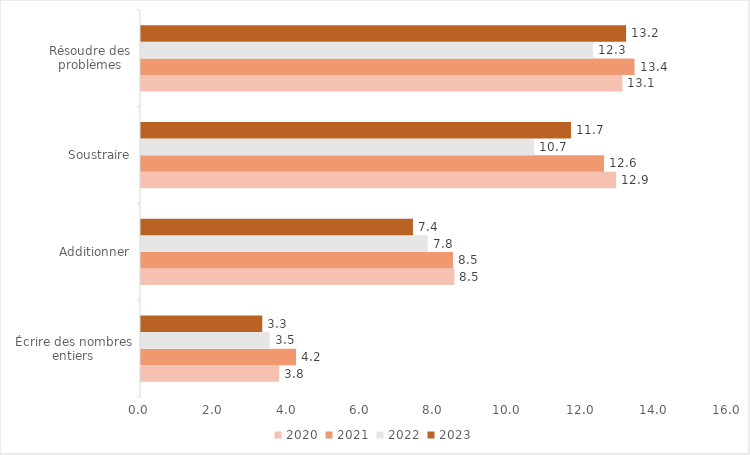
| Category | 2020 | 2021 | 2022 | 2023 |
|---|---|---|---|---|
| Écrire des nombres entiers | 3.76 | 4.22 | 3.5 | 3.3 |
| Additionner | 8.53 | 8.49 | 7.8 | 7.4 |
| Soustraire | 12.93 | 12.6 | 10.7 | 11.7 |
| Résoudre des problèmes | 13.1 | 13.43 | 12.3 | 13.2 |